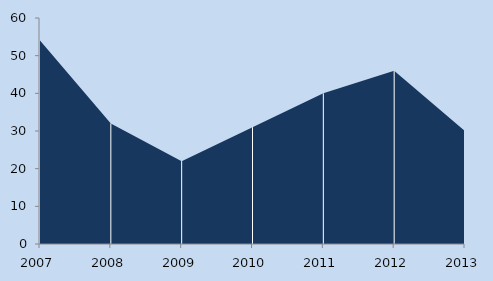
| Category | Показатель10 |
|---|---|
| 2007.0 | 54 |
| 2008.0 | 32 |
| 2009.0 | 22 |
| 2010.0 | 31 |
| 2011.0 | 40 |
| 2012.0 | 46 |
| 2013.0 | 30 |